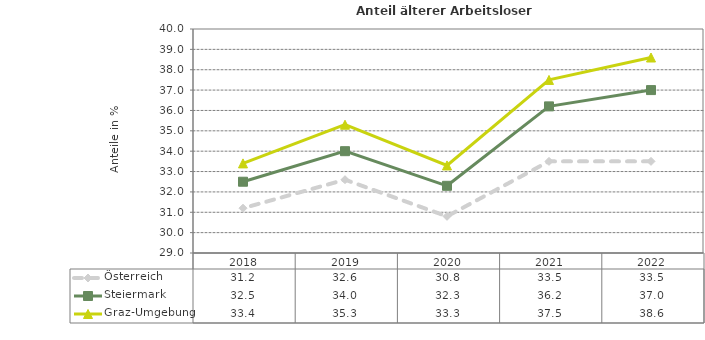
| Category | Österreich | Steiermark | Graz-Umgebung |
|---|---|---|---|
| 2022.0 | 33.5 | 37 | 38.6 |
| 2021.0 | 33.5 | 36.2 | 37.5 |
| 2020.0 | 30.8 | 32.3 | 33.3 |
| 2019.0 | 32.6 | 34 | 35.3 |
| 2018.0 | 31.2 | 32.5 | 33.4 |